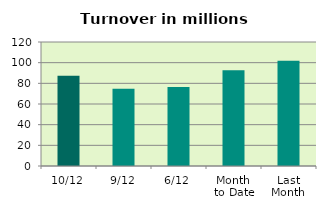
| Category | Series 0 |
|---|---|
| 10/12 | 87.378 |
| 9/12 | 74.876 |
| 6/12 | 76.503 |
| Month 
to Date | 92.728 |
| Last
Month | 101.866 |